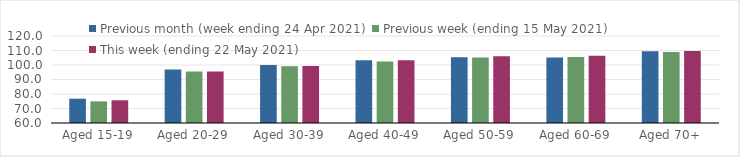
| Category | Previous month (week ending 24 Apr 2021) | Previous week (ending 15 May 2021) | This week (ending 22 May 2021) |
|---|---|---|---|
| Aged 15-19 | 76.75 | 74.91 | 75.68 |
| Aged 20-29 | 96.87 | 95.58 | 95.46 |
| Aged 30-39 | 99.99 | 99.22 | 99.33 |
| Aged 40-49 | 103.19 | 102.48 | 103.2 |
| Aged 50-59 | 105.34 | 105.25 | 106.12 |
| Aged 60-69 | 105.18 | 105.45 | 106.31 |
| Aged 70+ | 109.56 | 109 | 109.66 |